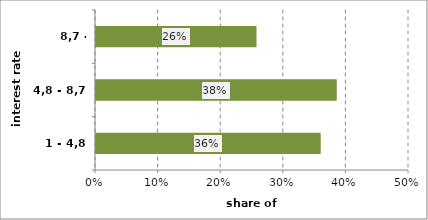
| Category | Series 0 |
|---|---|
| 1 - 4,8 | 0.359 |
| 4,8 - 8,7 | 0.385 |
| 8,7 - 12,5 | 0.256 |